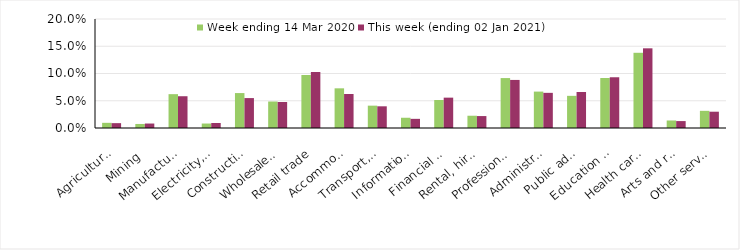
| Category | Week ending 14 Mar 2020 | This week (ending 02 Jan 2021) |
|---|---|---|
| Agriculture, forestry and fishing | 0.01 | 0.009 |
| Mining | 0.007 | 0.008 |
| Manufacturing | 0.062 | 0.058 |
| Electricity, gas, water and waste services | 0.008 | 0.009 |
| Construction | 0.064 | 0.055 |
| Wholesale trade | 0.049 | 0.048 |
| Retail trade | 0.097 | 0.103 |
| Accommodation and food services | 0.073 | 0.062 |
| Transport, postal and warehousing | 0.041 | 0.04 |
| Information media and telecommunications | 0.019 | 0.017 |
| Financial and insurance services | 0.051 | 0.056 |
| Rental, hiring and real estate services | 0.022 | 0.022 |
| Professional, scientific and technical services | 0.092 | 0.088 |
| Administrative and support services | 0.067 | 0.064 |
| Public administration and safety | 0.059 | 0.066 |
| Education and training | 0.092 | 0.093 |
| Health care and social assistance | 0.138 | 0.146 |
| Arts and recreation services | 0.014 | 0.013 |
| Other services | 0.032 | 0.03 |